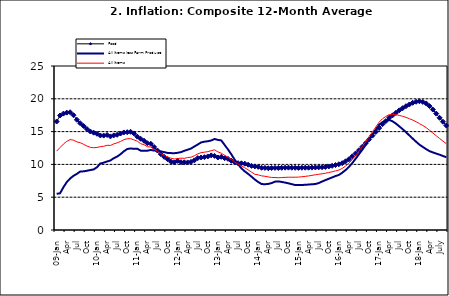
| Category | Food | All Items less Farm Produce | All Items |
|---|---|---|---|
| 09-Jan | 16.536 | 5.519 | 12.032 |
| Feb | 17.454 | 5.591 | 12.567 |
| Mar | 17.742 | 6.51 | 13.101 |
| Apr | 17.89 | 7.302 | 13.51 |
| May | 17.949 | 7.847 | 13.787 |
| June | 17.498 | 8.259 | 13.694 |
| Jul | 16.808 | 8.554 | 13.437 |
| Aug | 16.278 | 8.906 | 13.307 |
| Sep | 15.859 | 8.942 | 13.065 |
| Oct | 15.396 | 9.024 | 12.803 |
| Nov | 15.018 | 9.143 | 12.609 |
| Dec | 14.841 | 9.226 | 12.538 |
| 10-Jan | 14.668 | 9.567 | 12.586 |
| Feb | 14.411 | 10.138 | 12.7 |
| Mar | 14.395 | 10.269 | 12.757 |
| Apr | 14.489 | 10.444 | 12.915 |
| May | 14.266 | 10.597 | 12.893 |
| Jun | 14.424 | 10.948 | 13.132 |
| Jul | 14.514 | 11.193 | 13.284 |
| Aug | 14.706 | 11.549 | 13.5 |
| Sep | 14.872 | 11.997 | 13.764 |
| Oct | 14.906 | 12.345 | 13.908 |
| Nov | 14.967 | 12.423 | 13.928 |
| Dec | 14.723 | 12.383 | 13.74 |
| 11-Jan | 14.233 | 12.385 | 13.542 |
| Feb | 13.903 | 12.099 | 13.161 |
| Mar | 13.606 | 12.077 | 13.001 |
| Apr | 13.227 | 12.088 | 12.694 |
| May | 13.152 | 12.198 | 12.648 |
| Jun | 12.654 | 12.1 | 12.321 |
| Jul | 12.118 | 12.109 | 12.009 |
| Aug | 11.575 | 11.98 | 11.635 |
| Sep | 11.155 | 11.877 | 11.363 |
| Oct | 10.797 | 11.746 | 11.13 |
| Nov | 10.422 | 11.721 | 10.952 |
| Dec | 10.298 | 11.706 | 10.826 |
| 12-Jan | 10.538 | 11.765 | 10.886 |
| 12-Feb | 10.336 | 11.872 | 10.955 |
| 12-Mar | 10.325 | 12.075 | 10.914 |
| Apr | 10.304 | 12.242 | 11.054 |
| May | 10.387 | 12.419 | 11.096 |
| Jun | 10.617 | 12.732 | 11.32 |
| Jul | 10.963 | 13.032 | 11.599 |
| Aug | 11.056 | 13.349 | 11.791 |
| Sep | 11.104 | 13.467 | 11.859 |
| Oct | 11.216 | 13.525 | 11.948 |
| Nov | 11.372 | 13.649 | 12.091 |
| Dec | 11.296 | 13.873 | 12.224 |
| 13-Jan | 11.055 | 13.737 | 11.908 |
| Feb | 11.153 | 13.657 | 11.703 |
| Mar | 10.951 | 12.963 | 11.394 |
| Apr | 10.844 | 12.281 | 11.072 |
| May | 10.548 | 11.531 | 10.761 |
| Jun | 10.352 | 10.704 | 10.383 |
| Jul | 10.186 | 10.005 | 10.047 |
| Aug | 10.168 | 9.4 | 9.761 |
| Sep | 10.105 | 8.939 | 9.486 |
| Oct | 9.955 | 8.553 | 9.167 |
| Nov | 9.774 | 8.136 | 8.815 |
| Dec | 9.695 | 7.691 | 8.496 |
| 14-Jan | 9.626 | 7.317 | 8.408 |
| Feb | 9.484 | 7.005 | 8.257 |
| Mar | 9.464 | 6.976 | 8.19 |
| Apr | 9.416 | 7.03 | 8.092 |
| May | 9.448 | 7.151 | 8.012 |
| Jun | 9.464 | 7.369 | 7.998 |
| Jul | 9.459 | 7.411 | 7.968 |
| Aug | 9.481 | 7.325 | 7.996 |
| Sep | 9.501 | 7.228 | 8.027 |
| Oct | 9.508 | 7.116 | 8.047 |
| Nov | 9.492 | 6.991 | 8.046 |
| Dec | 9.481 | 6.854 | 8.047 |
| 15-Jan | 9.475 | 6.865 | 8.063 |
| Feb | 9.486 | 6.852 | 8.117 |
| Mar | 9.495 | 6.905 | 8.176 |
| Apr | 9.501 | 6.922 | 8.243 |
| May | 9.51 | 6.975 | 8.331 |
| Jun | 9.535 | 7.006 | 8.417 |
| Jul | 9.552 | 7.154 | 8.497 |
| Aug | 9.571 | 7.384 | 8.566 |
| Sep | 9.614 | 7.605 | 8.658 |
| Oct | 9.68 | 7.812 | 8.76 |
| Nov | 9.778 | 8.016 | 8.879 |
| Dec | 9.898 | 8.222 | 9.009 |
| 16-Jan | 10.017 | 8.391 | 9.13 |
| Feb | 10.184 | 8.732 | 9.386 |
| Mar | 10.471 | 9.132 | 9.751 |
| Apr | 10.786 | 9.614 | 10.182 |
| May | 11.221 | 10.196 | 10.746 |
| Jun | 11.672 | 10.864 | 11.372 |
| Jul | 12.162 | 11.553 | 12.045 |
| Aug | 12.696 | 12.247 | 12.744 |
| Sep | 13.238 | 12.98 | 13.454 |
| Oct | 13.817 | 13.757 | 14.206 |
| Nov | 14.386 | 14.542 | 14.958 |
| Dec | 14.946 | 15.307 | 15.697 |
| 17-Jan | 15.536 | 16.042 | 16.441 |
| Feb | 16.127 | 16.436 | 16.958 |
| Mar | 16.598 | 16.682 | 17.315 |
| Apr | 17.106 | 16.772 | 17.591 |
| May | 17.477 | 16.567 | 17.628 |
| Jun | 17.868 | 16.219 | 17.578 |
| Jul | 18.247 | 15.798 | 17.475 |
| Aug | 18.569 | 15.372 | 17.331 |
| Sep | 18.876 | 14.903 | 17.17 |
| Oct | 19.14 | 14.415 | 16.968 |
| Nov | 19.392 | 13.93 | 16.76 |
| Dec | 19.546 | 13.458 | 16.502 |
| 18-Jan | 19.621 | 13.01 | 16.215 |
| Feb | 19.521 | 12.668 | 15.93 |
| Mar | 19.294 | 12.33 | 15.599 |
| Apr | 18.886 | 12.021 | 15.196 |
| May | 18.359 | 11.828 | 14.793 |
| June | 17.745 | 11.651 | 14.371 |
| July | 17.102 | 11.478 | 13.95 |
| August | 16.501 | 11.285 | 13.546 |
| September | 15.923 | 11.092 | 13.157 |